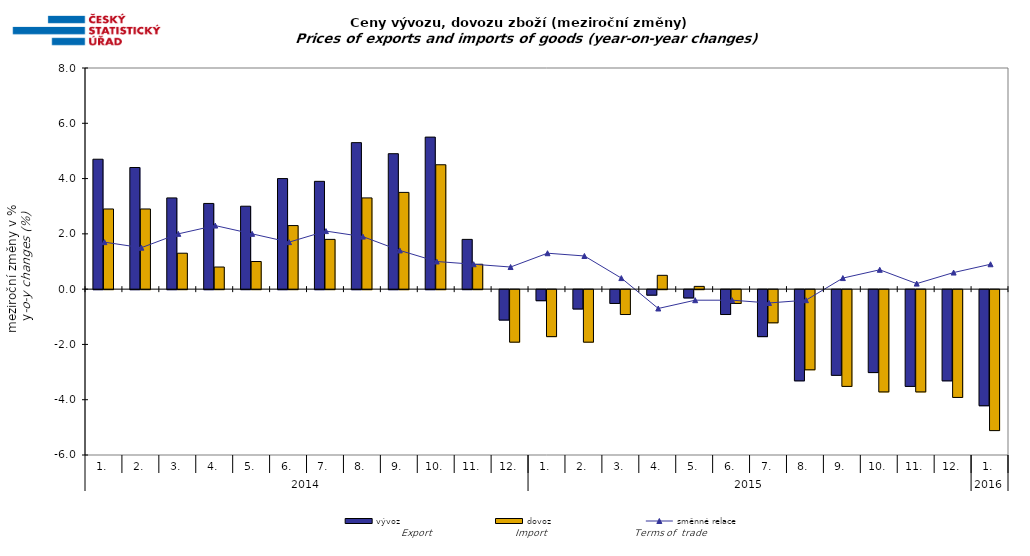
| Category | vývoz | dovoz |
|---|---|---|
| 0 | 4.7 | 2.9 |
| 1 | 4.4 | 2.9 |
| 2 | 3.3 | 1.3 |
| 3 | 3.1 | 0.8 |
| 4 | 3 | 1 |
| 5 | 4 | 2.3 |
| 6 | 3.9 | 1.8 |
| 7 | 5.3 | 3.3 |
| 8 | 4.9 | 3.5 |
| 9 | 5.5 | 4.5 |
| 10 | 1.8 | 0.9 |
| 11 | -1.1 | -1.9 |
| 12 | -0.4 | -1.7 |
| 13 | -0.7 | -1.9 |
| 14 | -0.5 | -0.9 |
| 15 | -0.2 | 0.5 |
| 16 | -0.3 | 0.1 |
| 17 | -0.9 | -0.5 |
| 18 | -1.7 | -1.2 |
| 19 | -3.3 | -2.9 |
| 20 | -3.1 | -3.5 |
| 21 | -3 | -3.7 |
| 22 | -3.5 | -3.7 |
| 23 | -3.3 | -3.9 |
| 24 | -4.2 | -5.1 |